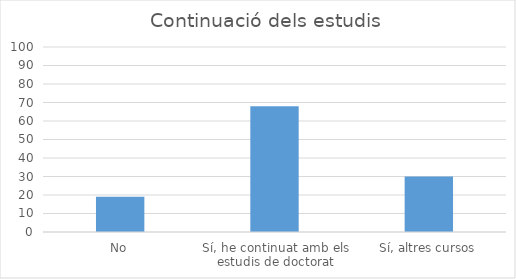
| Category | Series 0 |
|---|---|
| No | 19 |
| Sí, he continuat amb els estudis de doctorat | 68 |
| Sí, altres cursos | 30 |